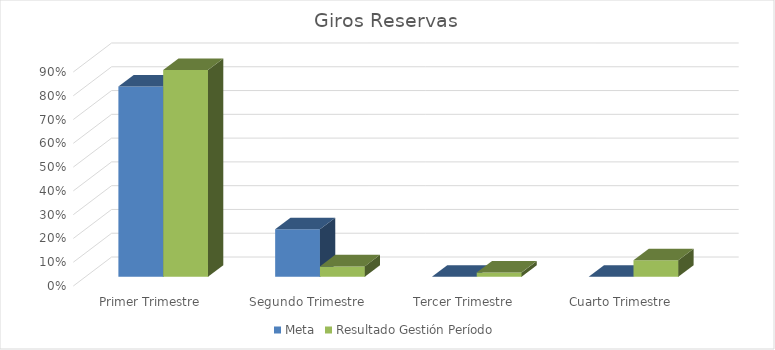
| Category | Meta | Resultado Gestión Período |
|---|---|---|
| Primer Trimestre | 0.8 | 0.87 |
| Segundo Trimestre | 0.2 | 0.044 |
| Tercer Trimestre | 0 | 0.018 |
| Cuarto Trimestre | 0 | 0.069 |